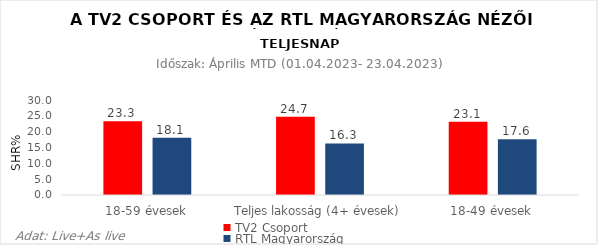
| Category | TV2 Csoport | RTL Magyarország |
|---|---|---|
| 18-59 évesek | 23.3 | 18.1 |
| Teljes lakosság (4+ évesek) | 24.7 | 16.3 |
| 18-49 évesek | 23.1 | 17.6 |